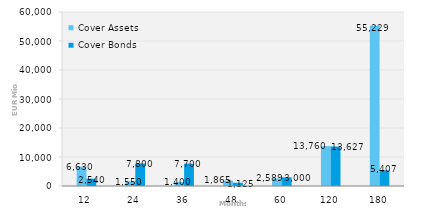
| Category | Cover Assets | Cover Bonds |
|---|---|---|
| 12.0 | 6629.51 | 2540 |
| 24.0 | 1550.23 | 7800 |
| 36.0 | 1400.46 | 7700 |
| 48.0 | 1864.67 | 1125 |
| 60.0 | 2589.24 | 3000 |
| 120.0 | 13760.15 | 13627.2 |
| 180.0 | 55228.52 | 5407 |